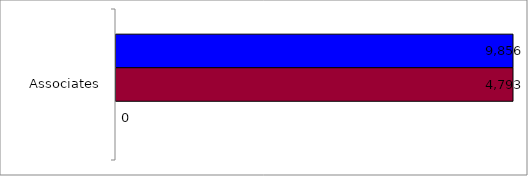
| Category | 50 states and D.C. | SREB states | State |
|---|---|---|---|
| Associates | 9856 | 4793 | 0 |